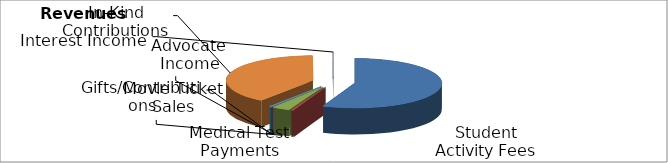
| Category | Series 0 |
|---|---|
| Student Activity Fees | 370240 |
| Medical Test Payments | 3000 |
| Movie Ticket Sales | 22000 |
| Advocate Income | 250 |
| Gifts/Contributions | 2000 |
| In-Kind Contributions | 263903 |
| Interest Income | 835 |